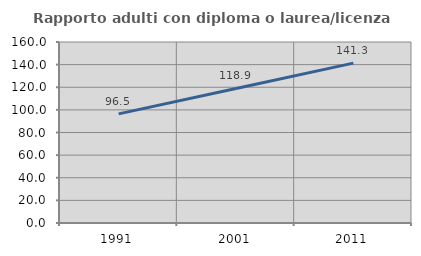
| Category | Rapporto adulti con diploma o laurea/licenza media  |
|---|---|
| 1991.0 | 96.466 |
| 2001.0 | 118.898 |
| 2011.0 | 141.327 |